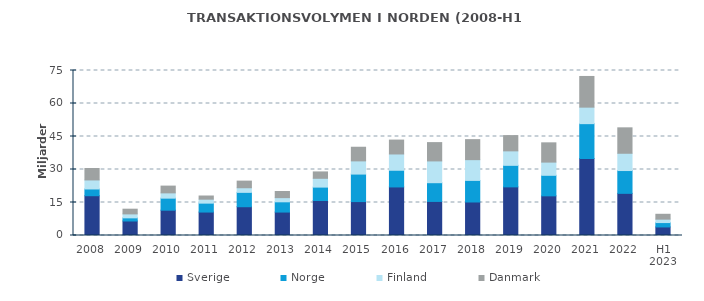
| Category | Sverige | Norge | Finland | Danmark |
|---|---|---|---|---|
| 2008 | 18.086 | 3.064 | 4.1 | 5.218 |
| 2009 | 6.597 | 1.423 | 1.8 | 2.141 |
| 2010 | 11.505 | 5.471 | 2.4 | 3.077 |
| 2011 | 10.657 | 4.049 | 1.8 | 1.446 |
| 2012 | 13.08 | 6.529 | 2.1 | 3.01 |
| 2013 | 10.654 | 4.661 | 1.9 | 2.784 |
| 2014 | 15.914 | 6.084 | 4 | 2.903 |
| 2015 | 15.417 | 12.5 | 6 | 6.2 |
| 2016 | 22.076 | 7.574 | 7.406 | 6.317 |
| 2017 | 15.489 | 8.511 | 9.9 | 8.325 |
| 2018 | 15.231 | 9.812 | 9.435 | 9.094 |
| 2019 | 22.101 | 9.791 | 6.577 | 6.942 |
| 2020 | 18.027 | 9.334 | 5.998 | 8.76 |
| 2021 | 34.993 | 15.847 | 7.497 | 13.953 |
| 2022 | 19.161 | 10.366 | 7.854 | 11.56 |
| H1 2023 | 3.888 | 1.989 | 1.55 | 2.216 |